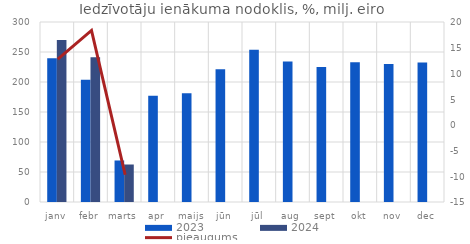
| Category | 2023 | 2024 |
|---|---|---|
| janv | 239.534 | 270.152 |
| febr | 203.945 | 241.398 |
| marts | 69.21 | 62.493 |
| apr | 176.948 | 0 |
| maijs | 181.073 | 0 |
| jūn | 221.435 | 0 |
| jūl | 253.867 | 0 |
| aug | 234.132 | 0 |
| sept | 225.118 | 0 |
| okt | 233.046 | 0 |
| nov | 229.983 | 0 |
| dec | 232.44 | 0 |